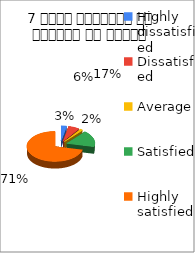
| Category | 7 विषय अवधारणा पर शिक्षक का ज्ञान  |
|---|---|
| Highly dissatisfied | 2 |
| Dissatisfied | 4 |
| Average | 1 |
| Satisfied | 11 |
| Highly satisfied | 45 |